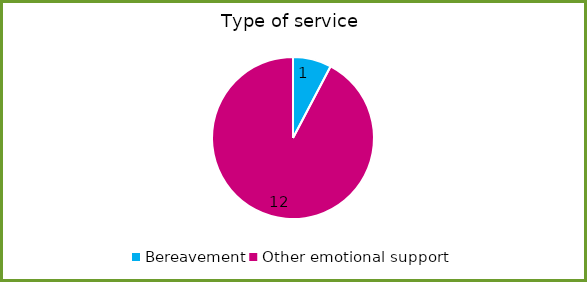
| Category | Series 0 |
|---|---|
| Bereavement | 1 |
| Other emotional support  | 12 |